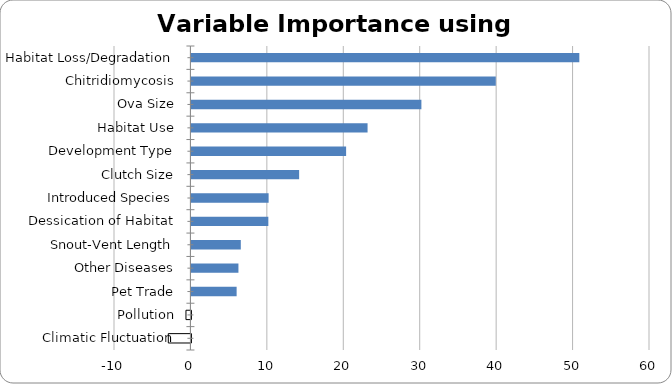
| Category | Series 0 |
|---|---|
| Habitat Loss/Degradation | 50.754 |
| Chitridiomycosis | 39.822 |
| Ova Size | 30.089 |
| Habitat Use | 23.046 |
| Development Type | 20.239 |
| Clutch Size | 14.092 |
| Introduced Species | 10.1 |
| Dessication of Habitat | 10.064 |
| Snout-Vent Length | 6.46 |
| Other Diseases | 6.15 |
| Pet Trade | 5.914 |
| Pollution | -0.649 |
| Climatic Fluctuation | -2.962 |